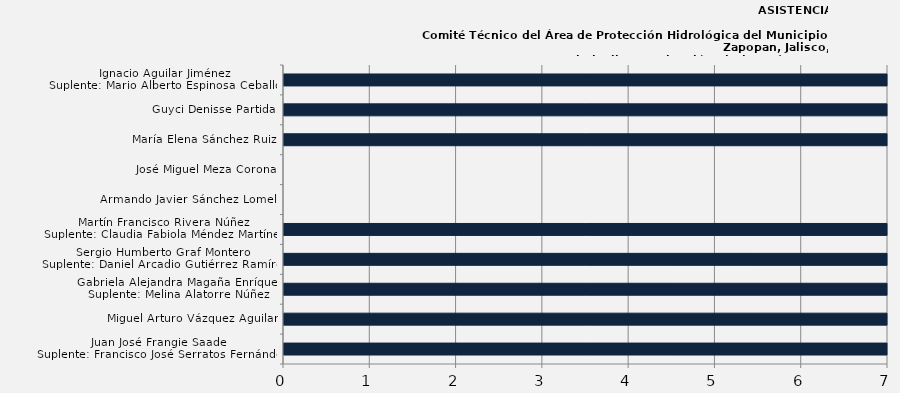
| Category | Juan José Frangie Saade
Suplente: Francisco José Serratos Fernández |
|---|---|
| Juan José Frangie Saade
Suplente: Francisco José Serratos Fernández | 100 |
| Miguel Arturo Vázquez Aguilar  | 100 |
| Gabriela Alejandra Magaña Enríquez
Suplente: Melina Alatorre Núñez | 100 |
| Sergio Humberto Graf Montero
Suplente: Daniel Arcadio Gutiérrez Ramírez | 100 |
| Martín Francisco Rivera Núñez
Suplente: Claudia Fabiola Méndez Martínez | 33.333 |
| Armando Javier Sánchez Lomelí  | 0 |
| José Miguel Meza Corona  | 0 |
| María Elena Sánchez Ruiz  | 100 |
| Guyci Denisse Partida  | 33.333 |
| Ignacio Aguilar Jiménez
Suplente: Mario Alberto Espinosa Ceballos | 100 |